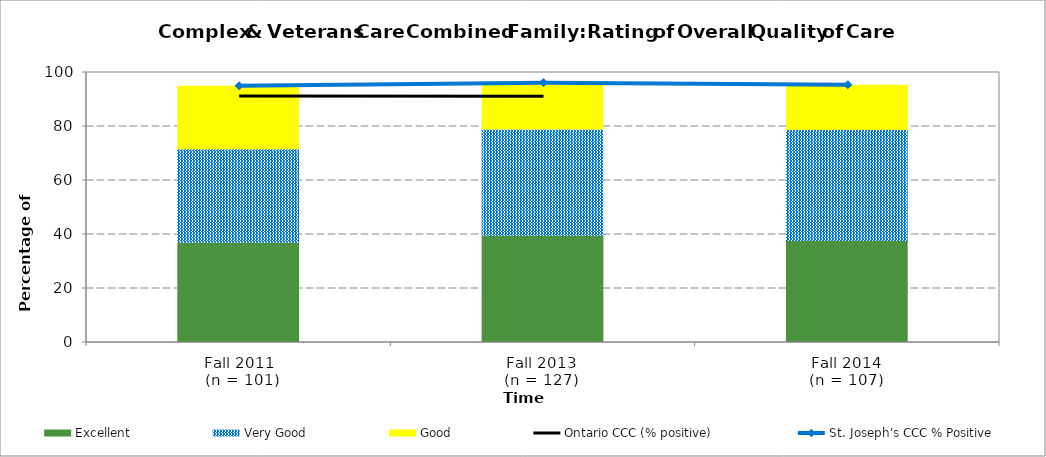
| Category | Excellent | Very Good | Good |
|---|---|---|---|
| Fall 2011
 (n = 101) | 36.73 | 34.69 | 23.47 |
| Fall 2013 
(n = 127)  | 39.37 | 39.37 | 17.32 |
| Fall 2014 
(n = 107)  | 37.4 | 41.1 | 16.8 |